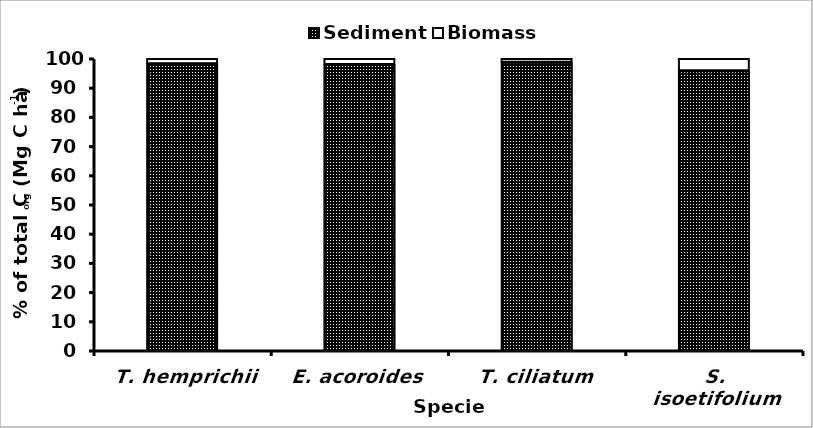
| Category | Sediment  | Biomass |
|---|---|---|
| T. hemprichii | 98.194 | 1.806 |
| E. acoroides | 97.947 | 2.053 |
| T. ciliatum | 98.747 | 1.253 |
| S. isoetifolium | 95.768 | 4.232 |